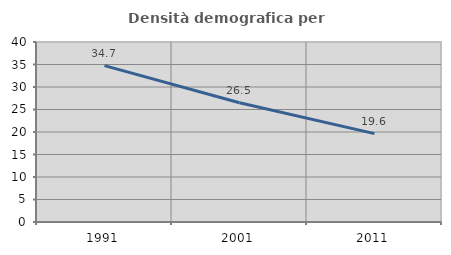
| Category | Densità demografica |
|---|---|
| 1991.0 | 34.746 |
| 2001.0 | 26.488 |
| 2011.0 | 19.642 |